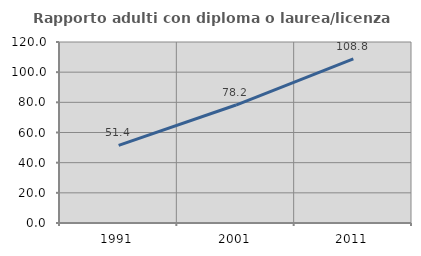
| Category | Rapporto adulti con diploma o laurea/licenza media  |
|---|---|
| 1991.0 | 51.412 |
| 2001.0 | 78.21 |
| 2011.0 | 108.834 |